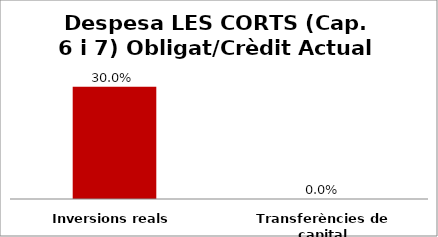
| Category | Series 0 |
|---|---|
| Inversions reals | 0.3 |
| Transferències de capital | 0 |